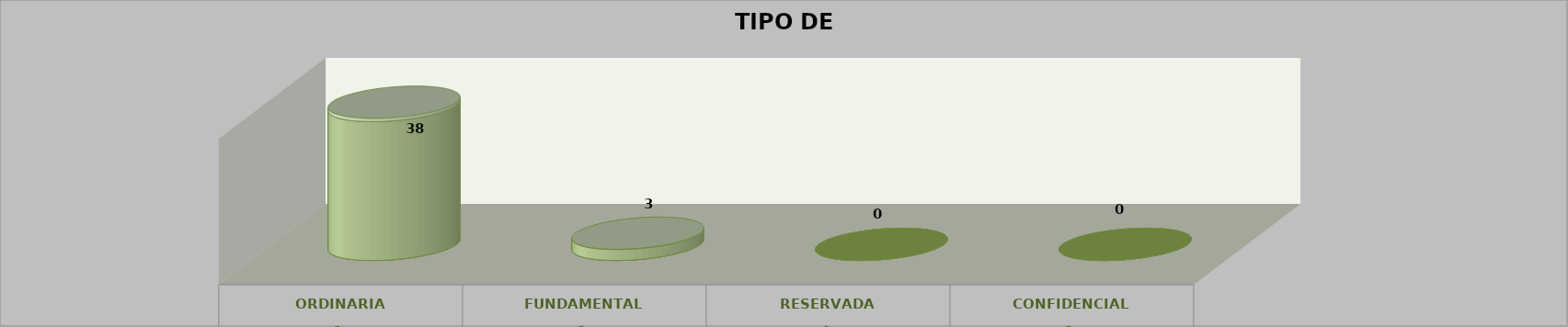
| Category | Series 0 | Series 2 | Series 1 | Series 3 | Series 4 |
|---|---|---|---|---|---|
| 0 |  |  |  | 38 | 0.927 |
| 1 |  |  |  | 3 | 0.073 |
| 2 |  |  |  | 0 | 0 |
| 3 |  |  |  | 0 | 0 |